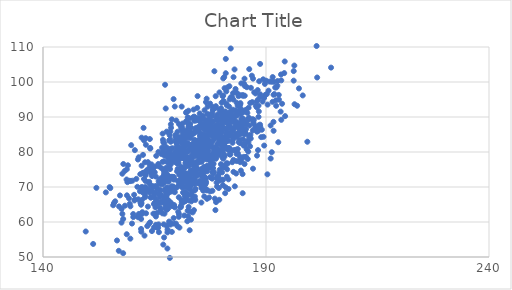
| Category | Series 0 |
|---|---|
| 170.1598739241214 | 80.306 |
| 163.93813223786776 | 75.937 |
| 191.29533481457239 | 79.938 |
| 172.67861897215235 | 87.104 |
| 166.12491777016325 | 67.054 |
| 177.30479510225493 | 75.632 |
| 163.81409291056931 | 71.473 |
| 176.97410853227544 | 80.413 |
| 187.01752697893295 | 89.365 |
| 163.074001310981 | 82.067 |
| 177.62027626228408 | 76.531 |
| 181.85472732294133 | 95.029 |
| 166.9736394503659 | 82.808 |
| 193.3656891891751 | 102.15 |
| 189.4518508534296 | 84.341 |
| 168.60895985691405 | 77.061 |
| 173.0228954982098 | 81.12 |
| 191.88396532871306 | 96.543 |
| 161.28587906896894 | 77.865 |
| 179.71085633939762 | 85.532 |
| 178.68101172885005 | 85.172 |
| 181.95251678327085 | 84.79 |
| 171.58584086453894 | 70.028 |
| 176.54386846700714 | 94.262 |
| 184.25613996578699 | 85.35 |
| 176.27221512878538 | 82.014 |
| 174.97842224445824 | 78.617 |
| 185.02249792120836 | 78.612 |
| 173.2316982742541 | 86.904 |
| 178.75985629061947 | 79.671 |
| 170.3179579177935 | 74.589 |
| 173.44142244879387 | 68.679 |
| 177.62283173926232 | 86.381 |
| 168.9083704309093 | 64.849 |
| 168.46407722062173 | 78.911 |
| 174.68521312295948 | 80.382 |
| 179.75574975039785 | 91.606 |
| 192.28083549865664 | 93.202 |
| 179.5666438054709 | 97.017 |
| 171.46553054270248 | 65.656 |
| 180.40675061311612 | 75.583 |
| 176.72306700366957 | 84.107 |
| 178.8355043614923 | 80.785 |
| 176.34055406444583 | 86.985 |
| 172.58793219463445 | 85.553 |
| 165.87110238556895 | 76.102 |
| 166.33316961961924 | 72.404 |
| 174.09639717700676 | 79.601 |
| 167.36587491412013 | 63.965 |
| 174.14073259904774 | 81.528 |
| 173.9518704658101 | 72.125 |
| 174.08821107163877 | 69.102 |
| 190.00389372877316 | 100.381 |
| 172.99348680052816 | 87.99 |
| 172.01682839185156 | 73.735 |
| 171.31494045423963 | 86.429 |
| 182.49668201398123 | 82.632 |
| 169.888905520434 | 89.004 |
| 180.26500680367556 | 95.963 |
| 166.90293270461095 | 75.054 |
| 185.18164864539008 | 100.943 |
| 171.29655757186666 | 88.127 |
| 183.58094222250602 | 87.17 |
| 178.81020554526978 | 85.135 |
| 165.8235827047579 | 58.344 |
| 168.71603879934625 | 86.916 |
| 184.23492003141783 | 93.638 |
| 178.3289825691761 | 80.216 |
| 180.82683577820103 | 81.615 |
| 185.59841109349247 | 87.878 |
| 175.64847301967168 | 83.653 |
| 165.64688543986907 | 65.954 |
| 172.29066286074632 | 72.784 |
| 177.1127783519198 | 86.562 |
| 173.90016963883014 | 75.98 |
| 167.1989941998041 | 78.99 |
| 169.3428741864064 | 72.884 |
| 177.3557113674186 | 87.589 |
| 171.14244034043594 | 87.127 |
| 180.24222910217418 | 83.761 |
| 181.1033156840317 | 93.796 |
| 176.5500831869961 | 79.611 |
| 171.01501065477308 | 72.858 |
| 174.19433061995292 | 86.022 |
| 180.62620386083353 | 101.399 |
| 188.92624170922466 | 84.247 |
| 173.64981955304347 | 80.491 |
| 170.3235448601778 | 62.887 |
| 170.47905893176738 | 74.783 |
| 173.56644381660237 | 62.742 |
| 163.84180069673934 | 68.944 |
| 166.71020369269655 | 81.247 |
| 170.8389871943529 | 73.651 |
| 167.9843080539701 | 73.317 |
| 180.480484575217 | 94.578 |
| 174.29530219544785 | 78.862 |
| 173.99834998466434 | 70.852 |
| 183.52036142595094 | 91.511 |
| 162.8751367335525 | 77.064 |
| 168.48280251754366 | 75.114 |
| 188.3467297025338 | 87.591 |
| 173.77519308859618 | 76.145 |
| 168.09559933104424 | 63.916 |
| 166.9739089139999 | 80.197 |
| 179.5884330611861 | 80.613 |
| 176.72320861542482 | 82.835 |
| 168.7950857547907 | 76.681 |
| 166.90269833311655 | 83.478 |
| 187.03441246753007 | 86.145 |
| 180.4387939883237 | 78.081 |
| 182.2677628768666 | 91.625 |
| 181.21917392747764 | 86.646 |
| 171.97384652887695 | 82.087 |
| 176.84913509661615 | 69.102 |
| 162.6458503574864 | 72.29 |
| 171.7133943871251 | 81.934 |
| 170.6430490254781 | 78.519 |
| 171.09321284538476 | 92.973 |
| 176.61497444023357 | 84.555 |
| 173.66041501701557 | 80.274 |
| 182.94697683656136 | 91.876 |
| 164.93140332667903 | 67.897 |
| 173.03557565738888 | 70.818 |
| 165.31579564197966 | 61.57 |
| 179.62783658028263 | 92.062 |
| 162.44707608800812 | 69.864 |
| 184.76682924155898 | 68.226 |
| 168.54143029178917 | 83.616 |
| 176.79117757653154 | 82.712 |
| 164.0317387730459 | 81.152 |
| 176.60247227313397 | 79.166 |
| 180.3949968664567 | 96.08 |
| 186.15874986530733 | 84.521 |
| 167.97167705369236 | 78.507 |
| 191.49963290967426 | 101.409 |
| 179.42382165987303 | 69.707 |
| 179.08973244399286 | 90.704 |
| 178.80321246474037 | 65.677 |
| 174.51256959972167 | 73.194 |
| 166.53163279570805 | 67.741 |
| 182.09175722039475 | 109.585 |
| 191.75816897484845 | 100.056 |
| 183.65030815492912 | 93.197 |
| 180.15002592978095 | 88.105 |
| 204.58419872648994 | 104.111 |
| 188.3204209746149 | 90.029 |
| 180.97812756000076 | 102.5 |
| 175.66142268231675 | 73.66 |
| 182.5544892676579 | 83.469 |
| 184.28177307194994 | 85.122 |
| 192.0662400562487 | 98.423 |
| 169.28045305740034 | 59.546 |
| 158.92733281528223 | 71.393 |
| 193.28621622457382 | 91.534 |
| 175.1922958617002 | 71.347 |
| 169.98025153577794 | 82.526 |
| 176.5771008401843 | 88.991 |
| 165.9261386827732 | 71.645 |
| 180.11427632508403 | 91.07 |
| 187.22729958011456 | 88.078 |
| 173.27973532542708 | 77.218 |
| 170.164059206376 | 58.789 |
| 172.55711478438943 | 69.638 |
| 151.9727776786648 | 69.756 |
| 188.68280111322048 | 105.166 |
| 157.05059285346772 | 64.45 |
| 161.97867299492026 | 64.932 |
| 170.07059992299529 | 79.789 |
| 172.44850767603165 | 85.814 |
| 167.29909772017322 | 69.285 |
| 173.10909763017793 | 84.729 |
| 181.45403008762352 | 91.038 |
| 174.2973355897016 | 89.007 |
| 175.02569933727662 | 77.118 |
| 170.59674295930745 | 58.404 |
| 177.72333033634587 | 72.68 |
| 171.97617237484238 | 82.132 |
| 171.9222767942284 | 72.958 |
| 165.31033798109556 | 59.187 |
| 172.12739242998978 | 76.785 |
| 199.26819787251733 | 82.932 |
| 176.5652611056708 | 71.349 |
| 162.27495894847542 | 62.811 |
| 166.21274546083538 | 70.883 |
| 163.53844809270046 | 77.094 |
| 165.3949957990289 | 78.898 |
| 184.98515105950227 | 88.583 |
| 180.20251943550693 | 87.778 |
| 174.08481177915561 | 73.342 |
| 167.6501310319177 | 74.003 |
| 181.92916307613572 | 88.781 |
| 175.2143414840696 | 84.399 |
| 177.45547184963797 | 72.793 |
| 174.6363775004824 | 79.418 |
| 183.2780505122876 | 85.257 |
| 179.43887642056785 | 84.282 |
| 165.88058055883374 | 76.03 |
| 181.5931280937699 | 69.427 |
| 177.0354125493783 | 78.949 |
| 188.52625126078442 | 86.746 |
| 177.28390574252106 | 78.431 |
| 176.93519390255543 | 78.24 |
| 196.98290373305383 | 93.215 |
| 180.0430187466448 | 90.331 |
| 157.2574656627473 | 67.592 |
| 180.84123871557375 | 68.234 |
| 161.49071708037127 | 62.303 |
| 184.38965610752007 | 90.822 |
| 174.29239776060692 | 73.924 |
| 174.47354613836896 | 89.751 |
| 182.69516370968336 | 94.982 |
| 180.52911111164195 | 88.673 |
| 171.9429052023558 | 73.783 |
| 181.353730193044 | 88.114 |
| 163.68203843079777 | 69.096 |
| 176.2781562971353 | 70.525 |
| 179.52392914806052 | 66.355 |
| 167.30146022015578 | 65.164 |
| 185.97313229845298 | 89.124 |
| 182.44710055768437 | 85.916 |
| 170.97336863452804 | 64.723 |
| 196.40072403611936 | 93.653 |
| 194.19976663629177 | 105.866 |
| 188.69674991803382 | 95.823 |
| 172.75626177160171 | 66.146 |
| 177.36523917004493 | 85.569 |
| 172.62003074627552 | 91.794 |
| 178.70523818447137 | 80.385 |
| 174.05568307650364 | 67.265 |
| 181.19183596226134 | 89.32 |
| 182.35893641387742 | 95.654 |
| 171.52523570167202 | 79.272 |
| 168.55779630878374 | 79.761 |
| 179.60832832450495 | 74.952 |
| 175.19774860083658 | 81.874 |
| 168.3510293304 | 65.244 |
| 171.71805480092678 | 78.182 |
| 180.53826100817093 | 80.693 |
| 180.34699430872524 | 70.517 |
| 171.0110330334557 | 75.713 |
| 185.231820534326 | 96.077 |
| 168.44673196453402 | 49.741 |
| 173.64397923141044 | 74.198 |
| 171.1512417209454 | 79.873 |
| 178.22884531389406 | 78.334 |
| 183.32816592860175 | 84.595 |
| 173.08665880549106 | 74.628 |
| 176.24170612165224 | 72.866 |
| 184.47775623148829 | 87.216 |
| 181.71679843974056 | 92.988 |
| 176.2250502508158 | 91.944 |
| 159.44416569955973 | 71.774 |
| 159.95519406135568 | 59.556 |
| 196.35283372871947 | 104.702 |
| 170.66236357747823 | 80.692 |
| 182.7790875098744 | 89.392 |
| 183.99671693366892 | 87.596 |
| 177.5068002303311 | 77.967 |
| 172.45375696722795 | 89.918 |
| 177.9650553658711 | 74.251 |
| 175.35917139681268 | 83.394 |
| 168.8937223604892 | 72.924 |
| 173.16236568118592 | 71.423 |
| 166.37934007156872 | 63.449 |
| 175.69195980107295 | 83.579 |
| 180.62292439744257 | 84.019 |
| 186.46878356673946 | 94.011 |
| 191.70669159391585 | 86.061 |
| 188.3160467082102 | 93.241 |
| 170.77984421670791 | 71.261 |
| 168.13525767034332 | 71.51 |
| 162.11297160766134 | 76.086 |
| 156.99396541612182 | 51.766 |
| 168.56616071522944 | 69.789 |
| 172.12485951910384 | 76.892 |
| 175.74612601982184 | 80.449 |
| 172.4710431860725 | 77.135 |
| 175.93027785777588 | 78.709 |
| 164.87748703122995 | 75.581 |
| 157.7844957724155 | 73.796 |
| 177.03123325834895 | 80.221 |
| 180.71207515379967 | 98.239 |
| 176.71878697919485 | 69.04 |
| 169.94527689703781 | 77.636 |
| 172.33151653575223 | 68.07 |
| 161.74288790859688 | 68.775 |
| 169.0211710243573 | 81.075 |
| 177.91350542277897 | 91.1 |
| 181.54776837268543 | 83.173 |
| 169.5456384836203 | 92.99 |
| 167.04309092136674 | 81.052 |
| 171.04103222133685 | 66.283 |
| 175.7859662853977 | 89.668 |
| 172.0664264923135 | 77.672 |
| 176.40454400480124 | 86.192 |
| 178.69123753958502 | 86.077 |
| 163.51768980837062 | 64.407 |
| 180.41409266542053 | 101.027 |
| 168.2787150422738 | 83.291 |
| 169.55106293042448 | 68.519 |
| 174.1333554490928 | 74.99 |
| 201.471548785236 | 101.285 |
| 162.89951483087128 | 67.598 |
| 183.38997724155718 | 96.986 |
| 177.35154787130497 | 86.582 |
| 184.37798001681315 | 92.211 |
| 169.3652590304318 | 79.369 |
| 167.5002120020143 | 68.934 |
| 175.46689399291213 | 70.736 |
| 168.29207075603685 | 65.836 |
| 172.61033442996813 | 70.804 |
| 184.46945360554176 | 89.444 |
| 177.43927325547753 | 77.536 |
| 176.2984129889899 | 81.641 |
| 178.43350079616516 | 85.407 |
| 179.2439959929074 | 73.006 |
| 182.32685943267163 | 89.186 |
| 175.0563859565066 | 89.586 |
| 178.91027121426055 | 81.006 |
| 177.28152024012624 | 85.77 |
| 178.28026851622965 | 73.846 |
| 167.9544412885237 | 68.681 |
| 161.3640001582295 | 66.483 |
| 178.0448325127739 | 77.878 |
| 176.1049670470263 | 74.586 |
| 156.58828400731937 | 54.725 |
| 196.20741285360424 | 100.386 |
| 171.89420833928463 | 81.513 |
| 186.24206362829042 | 103.675 |
| 175.19506454382397 | 80.894 |
| 185.45670221156445 | 85.385 |
| 184.1252163562691 | 83.525 |
| 176.2295557423168 | 84.988 |
| 161.32959612578355 | 61.35 |
| 171.8062267357193 | 67.397 |
| 166.99819690758383 | 80.55 |
| 184.9380266094324 | 82.193 |
| 174.2006176712412 | 69.473 |
| 167.79265647513634 | 63.51 |
| 164.4512451300321 | 73.12 |
| 168.89200368788272 | 89.321 |
| 177.30080766544575 | 84.958 |
| 174.67601345571177 | 83.052 |
| 182.2740381125172 | 80.386 |
| 173.26529785356738 | 77.071 |
| 156.18237543605275 | 65.908 |
| 178.94008119838236 | 80.432 |
| 171.91099865743138 | 73.371 |
| 176.106724994033 | 75.565 |
| 167.6436229314226 | 67.287 |
| 158.82477258888756 | 67.618 |
| 179.05344787085627 | 89.566 |
| 182.5132768766699 | 92.093 |
| 164.00388039027615 | 59.889 |
| 179.01448378128836 | 80.92 |
| 168.30102526934388 | 72.995 |
| 169.63197538622475 | 77.258 |
| 171.06834103547217 | 80.322 |
| 174.6991360526361 | 81.514 |
| 172.3519510334258 | 82.694 |
| 162.40334542951427 | 68.446 |
| 181.22005785294334 | 72.949 |
| 170.14622721875926 | 78.754 |
| 157.97467388045587 | 51.084 |
| 178.72942570275245 | 92.648 |
| 172.88663955330398 | 57.651 |
| 181.8335634024234 | 87.402 |
| 175.85301605377998 | 71.032 |
| 176.4578496784891 | 86.825 |
| 171.63180349641718 | 75.315 |
| 173.90638095290345 | 90.112 |
| 174.9289932510987 | 82.804 |
| 169.67197256007924 | 80.098 |
| 175.9459751772544 | 72.723 |
| 168.13033380658993 | 78.437 |
| 172.22896097390108 | 70.23 |
| 180.72424113291203 | 78.768 |
| 172.65083954941483 | 64.301 |
| 175.88411594875598 | 78.419 |
| 162.22160026998472 | 62.329 |
| 173.1976983173633 | 77.81 |
| 185.28615269710093 | 98.829 |
| 175.99558731628701 | 71.927 |
| 177.9725386298791 | 85.487 |
| 178.16471411336963 | 92.12 |
| 159.59475749772622 | 64.477 |
| 183.99941216952118 | 82.977 |
| 171.6103174213672 | 73.329 |
| 170.89579168686745 | 64.217 |
| 167.20550913485232 | 82.432 |
| 188.14243919419687 | 97.688 |
| 192.2294082982413 | 94.769 |
| 177.1412864590327 | 82.571 |
| 160.4335109486878 | 67.769 |
| 168.27337407769738 | 60.12 |
| 188.67365764586202 | 87.813 |
| 160.05531933126636 | 71.798 |
| 166.85698202646265 | 71.826 |
| 183.37129566064243 | 84.283 |
| 177.61891920033432 | 75.566 |
| 172.09821630113305 | 70.126 |
| 180.75185484986125 | 75.701 |
| 168.11092520887303 | 68.26 |
| 180.25425062418833 | 78.387 |
| 182.81382702059955 | 84.255 |
| 181.7148644204439 | 80.84 |
| 157.61852607433445 | 63.725 |
| 166.12081171313636 | 71.955 |
| 172.47375546525564 | 67.826 |
| 179.95686582154963 | 92.486 |
| 172.28202869760932 | 84.146 |
| 189.5941693029561 | 81.84 |
| 167.9707521428058 | 72.545 |
| 180.40301552009544 | 89.82 |
| 170.95964379046603 | 86.95 |
| 189.0772441321366 | 86.367 |
| 178.95445013728408 | 86.651 |
| 167.7622538444516 | 58.864 |
| 185.02955617271968 | 88.554 |
| 176.72361650876618 | 79.664 |
| 181.15785394542166 | 76.783 |
| 172.74639092501712 | 73.679 |
| 189.5620304642148 | 95.43 |
| 181.48806413546836 | 80.632 |
| 171.32112271610967 | 85.558 |
| 180.29265677667502 | 75.81 |
| 176.77103663884571 | 74.463 |
| 176.33048352624263 | 86.362 |
| 167.37286767540513 | 99.211 |
| 168.3631399770668 | 75.886 |
| 173.37239624885262 | 74.76 |
| 186.50228201306564 | 84.903 |
| 184.78854466699255 | 89.434 |
| 175.8647151109782 | 90.275 |
| 179.53040654739945 | 79.23 |
| 162.17066228245767 | 66.307 |
| 169.80509756037077 | 82.864 |
| 184.19237002157104 | 85.411 |
| 177.0611784783706 | 81.2 |
| 192.5468169369421 | 98.985 |
| 170.84116989791573 | 64.304 |
| 168.8956184531297 | 57.171 |
| 164.42573004027648 | 57.406 |
| 184.1411850404213 | 78.691 |
| 173.65586743687737 | 71.847 |
| 176.75648465809016 | 77.865 |
| 178.24793522499354 | 76.623 |
| 166.96956703463212 | 53.548 |
| 176.75941718065357 | 76.03 |
| 177.36712215731828 | 85.335 |
| 165.99232793386054 | 57.092 |
| 181.28034856993162 | 88.325 |
| 173.32194421071753 | 77.054 |
| 171.34389063216136 | 73.493 |
| 165.3769371953444 | 70.313 |
| 178.39775242757423 | 83.904 |
| 179.70108133658394 | 85.026 |
| 168.6036681862721 | 59.277 |
| 182.71963171096348 | 86.844 |
| 171.7571976761161 | 71.609 |
| 179.6899888866801 | 86.349 |
| 171.91606723195 | 71.478 |
| 180.0754198996342 | 72.09 |
| 181.05000994224437 | 89.851 |
| 173.33909766386148 | 78.968 |
| 164.11343621560223 | 67.016 |
| 163.0272249728847 | 73.344 |
| 168.2124157074655 | 76.923 |
| 179.6968239256825 | 82.298 |
| 197.38961582004967 | 98.161 |
| 186.28669571996448 | 87.566 |
| 168.97065245456528 | 64.784 |
| 183.8799807192703 | 96.364 |
| 169.33613019199234 | 72.336 |
| 176.7294109230867 | 84.328 |
| 173.55173249362966 | 72.322 |
| 170.99117927754838 | 78.947 |
| 168.39403188554863 | 84.816 |
| 184.85869329647724 | 83.601 |
| 185.43737739422423 | 88.131 |
| 160.24537835644506 | 61.401 |
| 180.13237094883843 | 81.777 |
| 157.79714557714766 | 62.309 |
| 168.2846946622802 | 77.866 |
| 178.05896549275425 | 79.356 |
| 168.84564324228495 | 68.718 |
| 183.4975580557332 | 90.477 |
| 175.94325925596357 | 73.991 |
| 174.8674175748034 | 82.561 |
| 162.64369211278964 | 83.331 |
| 171.38687339958946 | 68.402 |
| 172.5327370970287 | 80.127 |
| 185.70512648611842 | 98.517 |
| 184.46732413892536 | 77.492 |
| 173.8425586986703 | 63.389 |
| 172.24349642887296 | 72.531 |
| 171.69851546577908 | 72.61 |
| 178.65670212389094 | 63.405 |
| 178.95824039326266 | 80.236 |
| 182.48393062598987 | 88.538 |
| 166.81542728994185 | 85.242 |
| 174.27205044140183 | 79.332 |
| 185.24440997409565 | 85.74 |
| 196.21377441013036 | 103.121 |
| 178.70131725080435 | 81.254 |
| 193.41984917805178 | 100.46 |
| 178.98013225558165 | 89.921 |
| 175.2354891717164 | 79.814 |
| 163.37797702018915 | 58.82 |
| 193.6042638433213 | 93.785 |
| 169.7956191096747 | 59.549 |
| 174.73172153662608 | 86.06 |
| 176.79303729565484 | 83.457 |
| 174.79778227114988 | 77.098 |
| 170.50369865803228 | 87.966 |
| 184.15386010947813 | 82.552 |
| 159.61381367671243 | 71.694 |
| 176.76924118813147 | 66.622 |
| 177.64051036541775 | 88.933 |
| 181.897623386245 | 90.463 |
| 175.5139151893463 | 84.129 |
| 176.558752568165 | 87.01 |
| 173.42489729629443 | 71.709 |
| 176.39094785143126 | 74.529 |
| 184.41081915212442 | 96.198 |
| 170.95989426498113 | 78.198 |
| 172.54374513491854 | 78.475 |
| 166.89165202101634 | 72.806 |
| 162.90718485087058 | 68.365 |
| 172.9258856998699 | 69.424 |
| 191.67511324122083 | 88.594 |
| 179.7730264064192 | 89.34 |
| 177.19895173713937 | 81.571 |
| 166.36968245580317 | 75.569 |
| 169.21702768810994 | 70.14 |
| 186.91193697125178 | 94.257 |
| 155.09146503236028 | 69.679 |
| 175.65849404545506 | 89.334 |
| 160.59091166666443 | 66.42 |
| 178.07571351010236 | 92.009 |
| 183.24175360855864 | 88.091 |
| 166.48515438161326 | 71.609 |
| 170.76527494730868 | 74.028 |
| 176.05986930806597 | 79.356 |
| 174.8638745700521 | 82.172 |
| 176.89137480176478 | 75.296 |
| 170.19394351391824 | 76.799 |
| 168.1520012200927 | 80.708 |
| 164.40307678089363 | 74.996 |
| 174.18708632820562 | 77.065 |
| 174.63245349087344 | 83.237 |
| 177.9365040067146 | 84.592 |
| 185.82479751896295 | 91.154 |
| 178.7201135368394 | 95.951 |
| 163.34344863881245 | 74.866 |
| 175.08304157430058 | 78.596 |
| 162.54233155407863 | 86.892 |
| 167.81735761982839 | 69.845 |
| 188.4673380497087 | 100.215 |
| 164.05391565039508 | 80.982 |
| 198.23581818295082 | 96.163 |
| 167.7329931488068 | 81.295 |
| 169.70038671730418 | 84.85 |
| 170.18737307429097 | 75.15 |
| 172.70194540603407 | 82.146 |
| 173.6341876844127 | 81.747 |
| 167.89953164784868 | 57.019 |
| 188.2109851707771 | 80.537 |
| 161.30340538272134 | 61.677 |
| 168.5017857118466 | 77.73 |
| 167.6099167556207 | 75.008 |
| 165.84807168473685 | 68.074 |
| 181.46289690872524 | 90.48 |
| 179.34801194824664 | 84.694 |
| 178.90900774659292 | 72.57 |
| 167.59691331253146 | 66.293 |
| 174.87087680838948 | 87.237 |
| 175.09097307955804 | 81.353 |
| 175.59834805420738 | 85.255 |
| 187.26664636292708 | 89.183 |
| 175.64458055764277 | 83.249 |
| 183.3357635012517 | 90.351 |
| 165.85240371115256 | 76.576 |
| 172.0881356369103 | 88.784 |
| 176.5796942040156 | 84.065 |
| 183.93758271409436 | 86.759 |
| 173.51619609031124 | 81.503 |
| 172.40297622203815 | 72.35 |
| 174.33527617199329 | 86.29 |
| 187.08407436529916 | 100.958 |
| 162.0923023820868 | 65.357 |
| 173.44781826152663 | 78.274 |
| 167.7487286151009 | 69.685 |
| 183.89448761763958 | 82.819 |
| 179.2333649718208 | 84.936 |
| 178.09889872681381 | 92.833 |
| 168.10197310715498 | 72.041 |
| 170.44533786001043 | 61.47 |
| 174.39411796899236 | 73.859 |
| 175.4984794106776 | 73.244 |
| 176.5316694929815 | 78.814 |
| 154.08912599225403 | 68.451 |
| 173.50837799426986 | 82.337 |
| 175.53570926374252 | 69.707 |
| 173.0771560934599 | 73.188 |
| 171.19331514512922 | 69.903 |
| 165.00156654277103 | 75.797 |
| 158.79068792980954 | 75.062 |
| 170.42088824103337 | 84.281 |
| 176.1642017659343 | 81.391 |
| 171.73341617087752 | 75.564 |
| 191.68864001600986 | 96.358 |
| 163.79645757409847 | 71.161 |
| 172.92149022865385 | 81.014 |
| 176.45857231769477 | 69.434 |
| 171.28353820415037 | 69.992 |
| 172.05944154078634 | 91.26 |
| 168.83121640309275 | 70.208 |
| 182.50011399665917 | 89.936 |
| 176.5893713443987 | 83.219 |
| 163.93680990050612 | 68.424 |
| 181.94785967759896 | 84.625 |
| 181.23143738156924 | 84.621 |
| 172.03967065514314 | 76.964 |
| 171.6087866441235 | 78.445 |
| 171.93448082646196 | 76.813 |
| 167.23208703201544 | 62.376 |
| 176.72581696998955 | 88.976 |
| 191.05349394068074 | 78.142 |
| 182.71215333946932 | 77.747 |
| 181.85741699889658 | 85.201 |
| 176.86379410476886 | 87.783 |
| 162.03492135318118 | 57.231 |
| 178.4078655522512 | 80.524 |
| 170.64591487203455 | 81.29 |
| 179.40129423995765 | 79.318 |
| 173.3581994051918 | 67.813 |
| 173.5549291573431 | 81.258 |
| 175.91494008505467 | 81.636 |
| 163.11410190491887 | 62.484 |
| 172.31824849593394 | 85.485 |
| 165.6807268843351 | 62.637 |
| 172.0711738591282 | 78.682 |
| 161.8638664164163 | 65.495 |
| 165.58892848509822 | 69.514 |
| 165.92049907325438 | 59.312 |
| 187.98606219833326 | 85.808 |
| 168.67270408587893 | 80.953 |
| 165.0793566849432 | 62.304 |
| 170.15757763648887 | 85.788 |
| 173.64828502640842 | 71.079 |
| 177.48152447724038 | 79.094 |
| 175.14306264568796 | 91.017 |
| 187.66661929257128 | 96.723 |
| 164.75425146808072 | 62.38 |
| 178.23202458563546 | 88.713 |
| 170.64170651601108 | 79.342 |
| 190.17606467004643 | 96.546 |
| 178.2007448861284 | 79.115 |
| 174.4062007606691 | 75.499 |
| 181.87268892514325 | 91.358 |
| 176.8094483904344 | 88.573 |
| 183.82174585774368 | 84.948 |
| 175.2803516008754 | 88.573 |
| 172.40161712603785 | 76.441 |
| 166.57800339672707 | 79.397 |
| 177.77693068196518 | 84.913 |
| 151.24582000025708 | 53.725 |
| 177.47295642660484 | 93.841 |
| 168.5455869252494 | 59.695 |
| 169.17272987563962 | 72.727 |
| 167.30875631834618 | 72.126 |
| 174.02985216751185 | 72.052 |
| 182.05752151817137 | 89.974 |
| 185.52072120840145 | 92.038 |
| 167.76398189651002 | 69.252 |
| 181.74339691518122 | 81.12 |
| 162.15480586927546 | 69.966 |
| 168.646865846853 | 77.135 |
| 185.18975190731183 | 76.561 |
| 177.5849336033075 | 78.234 |
| 174.21524484561215 | 82.238 |
| 177.2901182791604 | 85.661 |
| 167.62856922387874 | 67.329 |
| 172.03029039071305 | 84.076 |
| 178.58795307181106 | 85.205 |
| 169.71638208483202 | 83.24 |
| 176.4604572161243 | 72.52 |
| 175.67860410812384 | 80.515 |
| 171.55159872914882 | 78.799 |
| 162.42221572981654 | 69.232 |
| 176.70845360939128 | 82.663 |
| 183.00943535559435 | 70.193 |
| 162.00353917486456 | 60.866 |
| 180.13322351321037 | 83.573 |
| 167.88750645228168 | 52.425 |
| 181.23785281552057 | 88.481 |
| 167.15826605473418 | 77.35 |
| 182.6136677132243 | 96.803 |
| 173.9291475324775 | 83.497 |
| 176.5219190984473 | 82.694 |
| 179.4539087028288 | 85.7 |
| 184.82898571894935 | 96.246 |
| 176.83254522709814 | 90.842 |
| 177.29773653669454 | 82.586 |
| 177.36516196247757 | 82.338 |
| 177.765004703943 | 82.433 |
| 166.4414239457848 | 65.688 |
| 172.26199607201005 | 91.462 |
| 175.93187741774835 | 75.518 |
| 180.1171242729889 | 80.209 |
| 170.73126117978558 | 71.972 |
| 162.76019905173328 | 56.112 |
| 181.2830081205844 | 75.061 |
| 175.50753013355776 | 79.284 |
| 189.83306457148586 | 96.317 |
| 184.82695389637274 | 87.607 |
| 172.1978509199168 | 67.504 |
| 191.26434657226932 | 100.072 |
| 168.5359270150081 | 77.202 |
| 178.9467145869275 | 89.237 |
| 172.12293566069894 | 73.236 |
| 173.2800528613206 | 73.807 |
| 174.65965690361273 | 95.964 |
| 174.3399125690626 | 82.337 |
| 171.5384670378297 | 84.664 |
| 166.5697397230291 | 65.686 |
| 181.8534997658804 | 90.369 |
| 177.93282252067934 | 81.411 |
| 175.70761970898462 | 87.897 |
| 172.9049231827634 | 89.574 |
| 178.9226418210874 | 71.242 |
| 169.23877815362397 | 78.455 |
| 158.3684626355405 | 64.658 |
| 162.9979737661111 | 73.765 |
| 167.50441479220683 | 65.924 |
| 166.28006830312282 | 69.128 |
| 167.3664712889423 | 68.936 |
| 179.8926870013329 | 84.429 |
| 170.96704000080726 | 71.971 |
| 189.36569398779272 | 100.762 |
| 187.92056058254354 | 92.782 |
| 167.74506035499405 | 72.655 |
| 174.00380205635742 | 85.485 |
| 170.01629190038258 | 81.259 |
| 175.7730455958986 | 86.846 |
| 174.63476642881116 | 79.298 |
| 183.67080174393743 | 80.843 |
| 172.1717036592725 | 71.817 |
| 183.68305152376806 | 79.646 |
| 167.9248326906523 | 57.842 |
| 162.6144063882323 | 74.138 |
| 171.3011053420693 | 81.222 |
| 163.70306694881597 | 59.369 |
| 178.01277532696764 | 90.271 |
| 186.0964823695132 | 92.654 |
| 160.98788038802002 | 48.18 |
| 172.35846930048115 | 69.974 |
| 181.90883938640025 | 85.525 |
| 188.24166799339554 | 94.978 |
| 186.05933285023974 | 89.546 |
| 201.34388050378746 | 110.279 |
| 174.5767727302161 | 92.596 |
| 183.2802138244716 | 87.429 |
| 162.63052208514233 | 69.305 |
| 172.10316370304267 | 85.85 |
| 169.97129022310634 | 78.84 |
| 175.16632272800493 | 71.749 |
| 165.05552164591563 | 74.196 |
| 184.72319523810535 | 85.505 |
| 164.78933018314336 | 70.22 |
| 177.23662932967432 | 83.343 |
| 185.51142816777173 | 86.526 |
| 167.0656072592678 | 59.322 |
| 171.68953340586265 | 80.328 |
| 187.36581928373545 | 97.054 |
| 163.22717799204378 | 74.584 |
| 162.42628941013103 | 79.178 |
| 171.29906424134435 | 80.187 |
| 155.9150555194415 | 65.401 |
| 175.7798898067508 | 73.712 |
| 178.31434181760469 | 74.319 |
| 172.6297702401903 | 87.103 |
| 174.7276631103174 | 71.127 |
| 175.7166406959105 | 73.147 |
| 188.70509627850365 | 87.29 |
| 177.38860643197802 | 81.686 |
| 168.6457644777587 | 82.924 |
| 171.84276471619808 | 68.578 |
| 179.26452247844276 | 80.022 |
| 167.63032389063042 | 67.945 |
| 173.0491299887429 | 62.939 |
| 175.71912499561014 | 70.338 |
| 170.18609030310316 | 76.668 |
| 175.35319157030233 | 87.53 |
| 178.7861373351488 | 84.896 |
| 160.22235440652233 | 62.27 |
| 181.3716018977566 | 98.456 |
| 180.4865441770138 | 84.178 |
| 184.47060533929312 | 99.607 |
| 167.96614779708693 | 64.537 |
| 170.01450948334846 | 81.79 |
| 181.26548608088942 | 85.695 |
| 178.75960046678622 | 87.36 |
| 169.9242413560579 | 76.911 |
| 173.68127357338167 | 89.963 |
| 174.38071733023838 | 76.356 |
| 172.44941101696665 | 67.609 |
| 172.43110761896 | 63.202 |
| 176.4607742599561 | 71.787 |
| 167.72080811458798 | 85.818 |
| 172.10402422832385 | 73.893 |
| 164.1656622580226 | 76.029 |
| 171.35833455042817 | 72.374 |
| 169.95076574812074 | 77.304 |
| 167.9361694268267 | 71.819 |
| 164.872125095462 | 58.419 |
| 187.73607028744945 | 87.204 |
| 171.58943439404962 | 78.135 |
| 178.77101933700678 | 78.078 |
| 180.7635456572752 | 83.257 |
| 182.43178642405306 | 77.09 |
| 175.2135103032883 | 84.844 |
| 155.7360058942316 | 64.79 |
| 179.57570996462115 | 84.299 |
| 184.10900417042745 | 93.029 |
| 160.59705024299012 | 80.525 |
| 179.67454794134505 | 87.101 |
| 186.82715193982727 | 101.803 |
| 182.72116217236763 | 101.39 |
| 170.05430129354963 | 74.475 |
| 157.05069915710885 | 45.409 |
| 169.82437985220352 | 83.296 |
| 180.9095301971766 | 91.583 |
| 180.61734183319626 | 79.298 |
| 175.6551917867178 | 82.614 |
| 175.95544656403155 | 89.454 |
| 185.51666661522117 | 78.602 |
| 170.53810583006734 | 74.201 |
| 185.09639784658503 | 91.841 |
| 190.78357072450706 | 100.121 |
| 171.45199370250901 | 79.849 |
| 177.2126719455678 | 89.473 |
| 171.56869051004992 | 83.147 |
| 185.640983458669 | 80.801 |
| 163.00596562512217 | 71.699 |
| 183.98219138360037 | 88.097 |
| 164.14740822918293 | 70.507 |
| 174.36229604214546 | 73.452 |
| 179.4444659950252 | 87.105 |
| 175.895191495488 | 83.553 |
| 167.85011003061211 | 64.39 |
| 185.83307715708642 | 83.196 |
| 163.9549562142513 | 83.708 |
| 159.58371261025232 | 55.247 |
| 179.73634230692892 | 89.05 |
| 179.37972851874332 | 83.468 |
| 190.3612499861261 | 93.545 |
| 166.72099384641453 | 70.734 |
| 170.3963513480456 | 76.809 |
| 184.3116621313 | 88.277 |
| 158.305556399303 | 74.556 |
| 163.41951668479345 | 69.373 |
| 173.60771557753796 | 85.147 |
| 162.10450498578606 | 69.856 |
| 175.21739692092584 | 82.491 |
| 176.4109547903888 | 78.768 |
| 174.8419049059872 | 86.811 |
| 168.64402850235894 | 65.565 |
| 169.33483965975407 | 72.11 |
| 181.20676663547778 | 88.694 |
| 171.09978860102814 | 65.57 |
| 167.91935231572947 | 72.456 |
| 190.56776430659554 | 97.518 |
| 182.4488010799259 | 86.356 |
| 183.2289698758106 | 90.599 |
| 171.17566634987443 | 74.062 |
| 188.39121607492865 | 91.589 |
| 194.08575455067466 | 102.541 |
| 180.488672112232 | 89.248 |
| 161.47033567637723 | 78.491 |
| 184.28102863894568 | 77.977 |
| 183.1691820644744 | 98.002 |
| 179.11116733176476 | 85.841 |
| 171.0740921474293 | 82.605 |
| 178.31213362065614 | 87.211 |
| 173.18346749448762 | 60.679 |
| 178.1970548970053 | 79.474 |
| 162.28626713335925 | 73.966 |
| 180.80440374831008 | 83.067 |
| 194.28381852187144 | 90.246 |
| 179.59046507976961 | 71.836 |
| 178.1407150791611 | 83.231 |
| 180.35401566083766 | 72.051 |
| 175.37521266600717 | 75.048 |
| 183.84188395199402 | 95.962 |
| 179.23606650540444 | 72.923 |
| 174.1492225923082 | 66.31 |
| 180.43478931454854 | 89.268 |
| 183.85399229277934 | 91.575 |
| 174.11259645553434 | 73.689 |
| 170.43857657858112 | 83.066 |
| 170.409606668186 | 77.794 |
| 173.76662239307313 | 92.119 |
| 183.42658459575938 | 94.071 |
| 181.97275944701593 | 79.247 |
| 170.9776912026752 | 72.153 |
| 183.21558607078416 | 91.846 |
| 168.97408377220896 | 64.55 |
| 192.33826652102942 | 98.466 |
| 177.33060000531748 | 86.212 |
| 163.9309371079275 | 74.497 |
| 182.29011281881475 | 90.777 |
| 174.42824197157304 | 75.107 |
| 174.2409947757234 | 73.62 |
| 170.4537407387416 | 67.07 |
| 172.61992628482756 | 87.916 |
| 175.34244572903313 | 83.371 |
| 172.44015474520174 | 88.358 |
| 182.25922518106194 | 85.003 |
| 161.15882401881197 | 70.045 |
| 164.21729244368544 | 66.979 |
| 170.52382114365363 | 70.74 |
| 165.08630241080238 | 65.535 |
| 182.80331045520586 | 80.533 |
| 167.84180215750646 | 68.918 |
| 168.56814267925043 | 85.815 |
| 185.90180001489932 | 77.985 |
| 184.3742324744008 | 74.696 |
| 170.8583640848548 | 83.541 |
| 165.44644774584492 | 65.609 |
| 173.93028176324344 | 88.924 |
| 165.2188985603716 | 64.15 |
| 177.46387056900227 | 68.751 |
| 179.8937515102307 | 76.517 |
| 167.95773451766954 | 76.99 |
| 171.8810425121032 | 65.922 |
| 165.29755403495864 | 72.979 |
| 186.5796477947526 | 83.85 |
| 185.09905072974817 | 99.462 |
| 170.20015586749528 | 71.738 |
| 169.58034054807393 | 64.174 |
| 176.3509011537535 | 81.995 |
| 176.63959547044095 | 83.792 |
| 176.08963178797606 | 80.133 |
| 165.2010180251123 | 68.469 |
| 171.11575810997252 | 70.776 |
| 182.11791998754467 | 86.892 |
| 189.23496952309205 | 94.402 |
| 165.08081762586724 | 66.852 |
| 176.09355556734138 | 83.329 |
| 168.15410267980397 | 85.606 |
| 179.0753083504022 | 82.216 |
| 176.54025613181022 | 84.419 |
| 171.33650036317363 | 72.662 |
| 184.98595382245472 | 81.823 |
| 178.14037757135455 | 75.408 |
| 168.40677905793933 | 77.424 |
| 161.99038259709857 | 58.012 |
| 169.29455499375385 | 61.12 |
| 162.1122305139906 | 84.101 |
| 177.24890663525036 | 66.984 |
| 171.33382520037415 | 83.838 |
| 168.34970959938337 | 59.635 |
| 192.7552167272051 | 82.791 |
| 160.50271395306072 | 66.162 |
| 178.52779955575775 | 66.673 |
| 180.6968498616115 | 76.087 |
| 181.22566139644923 | 93.366 |
| 177.18755327918126 | 90.691 |
| 172.54682375739029 | 61.624 |
| 182.0570188052954 | 88.891 |
| 187.57924545420596 | 86.859 |
| 177.61202151016187 | 81.674 |
| 159.28609609505514 | 66.759 |
| 174.30118259900556 | 82.612 |
| 173.93939942345708 | 66.462 |
| 173.03713639115452 | 83.974 |
| 174.1234093083286 | 83.049 |
| 179.55552436876704 | 73.979 |
| 169.21817316132737 | 69.311 |
| 171.25213133108343 | 82.503 |
| 172.67054086429584 | 75.905 |
| 176.01503854061846 | 74.927 |
| 173.4766236475572 | 74.527 |
| 164.85544989681995 | 65.132 |
| 178.42760299764413 | 103.077 |
| 175.5105677247303 | 65.555 |
| 174.5302672570014 | 86.312 |
| 173.92061947565549 | 80.747 |
| 192.9080913779309 | 94.957 |
| 169.52255590572048 | 69.338 |
| 174.24903264435525 | 82.66 |
| 176.35423044283965 | 83.857 |
| 180.6967598820837 | 89.13 |
| 172.92141892805964 | 73.957 |
| 177.28742213871206 | 81.559 |
| 183.4739203431912 | 88.545 |
| 187.162512245419 | 88.568 |
| 173.6667822003627 | 79.822 |
| 184.6717255000188 | 86.798 |
| 182.0998916877218 | 90.957 |
| 160.9250126557999 | 72.316 |
| 180.62368896857876 | 90.769 |
| 182.7127917038271 | 74.328 |
| 167.19000802323825 | 71.222 |
| 175.21986099236284 | 83.189 |
| 192.86263326427925 | 96.316 |
| 172.16572932398466 | 84.638 |
| 167.16279287755253 | 73.729 |
| 189.7458865701181 | 99.454 |
| 178.74130317392732 | 78.324 |
| 181.1546076394658 | 83.708 |
| 180.09953821265333 | 80.429 |
| 165.48409956893673 | 65.202 |
| 172.73167154446006 | 71.381 |
| 169.430753785944 | 77.67 |
| 181.85974532933116 | 79.363 |
| 177.57998639261024 | 76.229 |
| 173.79021502031313 | 80.58 |
| 168.67052073404105 | 87.923 |
| 183.31209364994012 | 73.855 |
| 168.22288658631967 | 71.851 |
| 184.74494152382 | 73.691 |
| 173.15121138940788 | 85.633 |
| 174.34759758380122 | 83.192 |
| 172.76091334980134 | 82.033 |
| 176.48480718290537 | 70.917 |
| 185.17519291926948 | 82.276 |
| 170.05139404261092 | 69.941 |
| 176.85018012288444 | 82.639 |
| 171.48791525387819 | 83.187 |
| 190.32119454322523 | 73.619 |
| 177.99470378657495 | 68.919 |
| 191.03973349034416 | 87.574 |
| 157.5993485607333 | 59.817 |
| 188.72188622696174 | 96.473 |
| 175.607436430844 | 84.942 |
| 172.10608708856324 | 86.122 |
| 165.56038552595444 | 58.382 |
| 172.10086438481932 | 66.455 |
| 169.2804239692472 | 95.114 |
| 186.6154243352218 | 98.338 |
| 171.19143508655662 | 79 |
| 187.0292093379779 | 89.178 |
| 172.62590500044354 | 85.702 |
| 172.10759308412372 | 80.201 |
| 166.8050924773551 | 77.179 |
| 172.90398010790287 | 81.577 |
| 186.4276662027694 | 81.625 |
| 158.772974642671 | 56.508 |
| 174.26186807793377 | 86.84 |
| 158.74037999224495 | 72.138 |
| 174.85656079223625 | 77.523 |
| 178.6572832993366 | 85.144 |
| 186.2008640647575 | 89.747 |
| 173.03193368614726 | 72.205 |
| 166.26041169171933 | 68.995 |
| 164.5802123915539 | 69.964 |
| 177.69347636084314 | 86.884 |
| 171.19945187296292 | 86.188 |
| 181.10367258676615 | 97.307 |
| 174.56310594541546 | 74.978 |
| 173.25954053649983 | 65.89 |
| 186.36053590582713 | 84.26 |
| 162.89492466934172 | 67.096 |
| 188.31733361489933 | 86.092 |
| 181.042946989625 | 85.201 |
| 167.51567943123018 | 92.428 |
| 167.61413027322484 | 75.496 |
| 175.70767238895436 | 80.375 |
| 166.22414165027908 | 64.132 |
| 183.99066636326097 | 85.72 |
| 180.15278643633698 | 74.176 |
| 159.0394417030369 | 76.202 |
| 182.9454629606617 | 103.59 |
| 171.219600068138 | 75.007 |
| 170.96118809954817 | 80.977 |
| 180.9842978233595 | 106.6 |
| 167.1530347533145 | 55.572 |
| 180.4552602966829 | 86.871 |
| 185.1665624264528 | 85.014 |
| 182.67327022058052 | 86.279 |
| 157.9786405412441 | 60.86 |
| 168.9829371282405 | 72.867 |
| 173.58184538748603 | 67.06 |
| 182.08777295685567 | 95.621 |
| 172.5859392858053 | 76.271 |
| 187.9092544149573 | 94.454 |
| 170.6596634825182 | 70.712 |
| 175.0034996979007 | 83.347 |
| 168.07863591646972 | 72.806 |
| 164.32709009764102 | 76.456 |
| 183.92609686597982 | 90.963 |
| 172.14273208019193 | 79.98 |
| 179.49936278816546 | 82.717 |
| 170.4667992332132 | 62.329 |
| 184.84555108421952 | 96.073 |
| 158.01180596539567 | 76.572 |
| 176.9892195785632 | 84.975 |
| 180.09045774361743 | 85.669 |
| 178.25173062950364 | 78.394 |
| 165.88932411774715 | 80.032 |
| 179.20660417340665 | 89.109 |
| 181.38446589662027 | 88.846 |
| 183.23248578246634 | 80.632 |
| 173.0790399391546 | 70.236 |
| 177.73889328113904 | 86.85 |
| 177.49247912371092 | 86.896 |
| 185.2587114236238 | 81.893 |
| 181.40909327419934 | 76.713 |
| 186.05279410869832 | 82.721 |
| 179.21261177938948 | 87.893 |
| 181.23611526920178 | 84.341 |
| 166.76830204726 | 62.474 |
| 171.62732459455813 | 78.378 |
| 168.9016973173778 | 78.858 |
| 171.2715105243488 | 84.62 |
| 174.9496130194904 | 85.893 |
| 164.38497800036242 | 68.9 |
| 176.92521363493398 | 92.966 |
| 176.160527012757 | 67.303 |
| 175.59569923299304 | 84.923 |
| 178.77592370003518 | 87.548 |
| 175.4166796199469 | 74.046 |
| 184.8547449720838 | 89.487 |
| 184.2102094264612 | 77.088 |
| 175.71286834726777 | 89.807 |
| 175.13237569615768 | 70.958 |
| 181.87769871152656 | 80.962 |
| 154.94324478564926 | 69.971 |
| 167.04390817701437 | 66.785 |
| 177.20498654489487 | 75.558 |
| 165.93135084907732 | 65.332 |
| 172.3622908577959 | 60.215 |
| 171.774249624401 | 66.111 |
| 187.08841863145474 | 75.235 |
| 172.5552318611938 | 80.496 |
| 178.76416120392477 | 93.086 |
| 184.88325239292328 | 91.367 |
| 167.0029758929733 | 73.047 |
| 176.69579998201078 | 95.226 |
| 163.03091047637045 | 83.952 |
| 180.05697800479106 | 94.094 |
| 177.929837933705 | 72.382 |
| 170.57127743396174 | 78.61 |
| 180.9868731135872 | 69.89 |
| 177.63507225448657 | 87.867 |
| 184.26279988685002 | 93.967 |
| 167.81857390764452 | 79.723 |
| 174.37738070036016 | 74.766 |
| 174.72435549218358 | 81.519 |
| 187.7068809317382 | 93.21 |
| 168.09646185267263 | 66.205 |
| 159.45179842156517 | 65.2 |
| 174.5530801294886 | 89.149 |
| 180.24413395045445 | 91.579 |
| 180.84102199045 | 82.669 |
| 186.0164966813287 | 80.11 |
| 179.6350656815426 | 80.45 |
| 167.51181143583335 | 67.335 |
| 181.57412718481208 | 72.191 |
| 193.42848893968093 | 89.187 |
| 182.74290168336634 | 89.042 |
| 170.52798308366525 | 79.776 |
| 167.18056063689946 | 74.326 |
| 181.78910223504684 | 98.795 |
| 168.06251311370363 | 66.144 |
| 170.26638723934772 | 78.547 |
| 187.77199116076216 | 87.237 |
| 170.5414877152733 | 73.505 |
| 192.59773240493126 | 100.272 |
| 181.6051206229521 | 81.136 |
| 175.57914678053143 | 77.18 |
| 176.20429990580172 | 75.738 |
| 159.77812171674444 | 81.952 |
| 176.0088815954145 | 77.977 |
| 149.58098388763227 | 57.288 |
| 180.01254352205905 | 89.362 |
| 180.66275275194093 | 82.496 |
| 172.61346199318714 | 76.352 |
| 180.10717197671576 | 83.026 |
| 177.80584168298654 | 78.403 |
| 181.7325973688924 | 87.081 |
| 183.42333870442138 | 77.405 |
| 169.40943976741414 | 64.848 |
| 176.10194591874952 | 87.909 |
| 180.8852471237908 | 86.58 |
| 183.40388462164253 | 79.443 |
| 179.0677565078049 | 84.374 |
| 164.25331308259152 | 73.917 |
| 191.4603896220015 | 94.331 |
| 178.64278875607735 | 81.253 |
| 169.70072295466568 | 84.303 |
| 175.83386564052068 | 80.804 |
| 182.461113259082 | 89.957 |
| 162.9610170336792 | 69.999 |
| 161.81190523613864 | 73.66 |
| 175.3733077214727 | 70.634 |
| 180.54885720290898 | 81.731 |
| 187.98891309567696 | 78.965 |
| 175.91319479685652 | 68.959 |
| 179.02369443714002 | 70.132 |
| 171.66461112648622 | 61.852 |